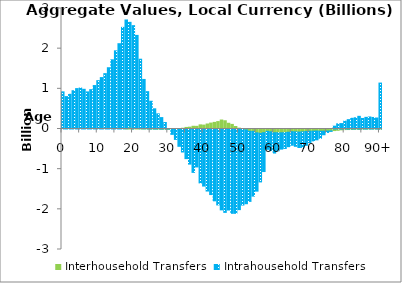
| Category | Interhousehold Transfers | Intrahousehold Transfers |
|---|---|---|
| 0 | 0 | 924.591 |
|  | 0 | 806.217 |
| 2 | 0 | 863.68 |
| 3 | 0 | 953.036 |
| 4 | 0 | 1005.53 |
| 5 | 0 | 1019.086 |
| 6 | 0 | 988.435 |
| 7 | 0 | 923.982 |
| 8 | 0 | 979.219 |
| 9 | 0 | 1081.787 |
| 10 | 0 | 1203.29 |
| 11 | 0 | 1279.365 |
| 12 | 0 | 1378.414 |
| 13 | 0 | 1525.289 |
| 14 | 0 | 1722.781 |
| 15 | 0 | 1946.299 |
| 16 | 0 | 2123.561 |
| 17 | 0 | 2530.279 |
| 18 | 6.385 | 2708.102 |
| 19 | 45.887 | 2610.066 |
| 20 | 0.094 | 2572.852 |
| 21 | 14.755 | 2315.53 |
| 22 | 6.086 | 1731.352 |
| 23 | 4.906 | 1228.78 |
| 24 | 1.33 | 928.129 |
| 25 | -4.147 | 690.675 |
| 26 | -3.312 | 502.507 |
| 27 | -6.007 | 377.05 |
| 28 | -6.974 | 283.816 |
| 29 | -9.331 | 161.096 |
| 30 | -9.018 | 7.902 |
| 31 | -5.617 | -127.708 |
| 32 | -1.733 | -256.841 |
| 33 | 11.024 | -430.955 |
| 34 | 18.411 | -572.755 |
| 35 | 39.029 | -737.55 |
| 36 | 45.74 | -873.998 |
| 37 | 67.841 | -1079.842 |
| 38 | 66.214 | -944.649 |
| 39 | 102.586 | -1341.563 |
| 40 | 97.142 | -1420.74 |
| 41 | 124.474 | -1544.574 |
| 42 | 147.105 | -1632.202 |
| 43 | 164.621 | -1788.311 |
| 44 | 184.608 | -1889.976 |
| 45 | 223.63 | -2013.51 |
| 46 | 204.786 | -2075.787 |
| 47 | 142.913 | -2017.217 |
| 48 | 114.64 | -2099.33 |
| 49 | 62.525 | -2099.598 |
| 50 | 20.576 | -2007.205 |
| 51 | -9.324 | -1883.911 |
| 52 | -24.192 | -1836.018 |
| 53 | -57.477 | -1745.056 |
| 54 | -58.847 | -1611.965 |
| 55 | -95.553 | -1451.42 |
| 56 | -107.761 | -1209.646 |
| 57 | -92.963 | -966.226 |
| 58 | -57.645 | -448.446 |
| 59 | -70.072 | -463.976 |
| 60 | -93.287 | -505.626 |
| 61 | -92.723 | -449.516 |
| 62 | -94.276 | -406.438 |
| 63 | -89.868 | -394.541 |
| 64 | -80.848 | -359.296 |
| 65 | -67.267 | -336.96 |
| 66 | -72.027 | -358.942 |
| 67 | -76.403 | -383.799 |
| 68 | -70.419 | -387.852 |
| 69 | -61.03 | -344.324 |
| 70 | -55.334 | -282.374 |
| 71 | -53.702 | -242.624 |
| 72 | -50.13 | -219.481 |
| 73 | -55.598 | -174.424 |
| 74 | -54.327 | -89.091 |
| 75 | -51.163 | -35.045 |
| 76 | -47.414 | -12.017 |
| 77 | -39.006 | 70.438 |
| 78 | -32.33 | 128.83 |
| 79 | -20.162 | 134.993 |
| 80 | -14.645 | 194.702 |
| 81 | -13.502 | 232.629 |
| 82 | -12.15 | 266.337 |
| 83 | -10.061 | 279.639 |
| 84 | -10.793 | 315.567 |
| 85 | -6.127 | 263.215 |
| 86 | -3.009 | 290.074 |
| 87 | -1.742 | 299.543 |
| 88 | -0.416 | 287.615 |
| 89 | -1.12 | 273.734 |
| 90+ | -7.158 | 1143.311 |